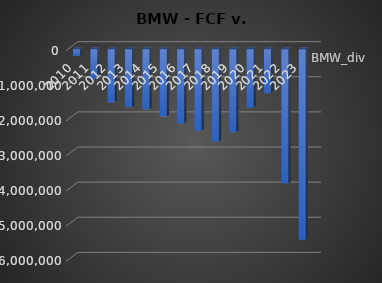
| Category | BMW_div | BWM_FCF |
|---|---|---|
| 2010.0 | -197000 |  |
| 2011.0 | -852000 |  |
| 2012.0 | -1516000 |  |
| 2013.0 | -1653000 |  |
| 2014.0 | -1715000 |  |
| 2015.0 | -1917000 |  |
| 2016.0 | -2121000 |  |
| 2017.0 | -2324000 |  |
| 2018.0 | -2630000 |  |
| 2019.0 | -2366000 |  |
| 2020.0 | -1671000 |  |
| 2021.0 | -1253000 |  |
| 2022.0 | -3827000 |  |
| 2023.0 | -5430000 |  |